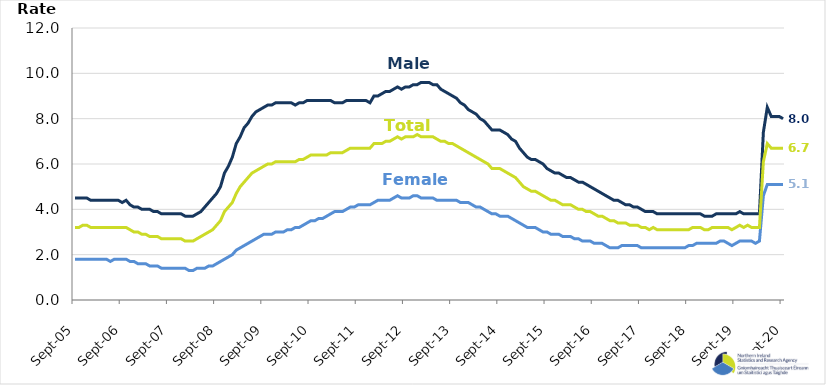
| Category | Male | Female | Total |
|---|---|---|---|
| 2005-09-01 | 4.5 | 1.8 | 3.2 |
| 2005-10-01 | 4.5 | 1.8 | 3.2 |
| 2005-11-01 | 4.5 | 1.8 | 3.3 |
| 2005-12-01 | 4.5 | 1.8 | 3.3 |
| 2006-01-01 | 4.4 | 1.8 | 3.2 |
| 2006-02-01 | 4.4 | 1.8 | 3.2 |
| 2006-03-01 | 4.4 | 1.8 | 3.2 |
| 2006-04-01 | 4.4 | 1.8 | 3.2 |
| 2006-05-01 | 4.4 | 1.8 | 3.2 |
| 2006-06-01 | 4.4 | 1.7 | 3.2 |
| 2006-07-01 | 4.4 | 1.8 | 3.2 |
| 2006-08-01 | 4.4 | 1.8 | 3.2 |
| 2006-09-01 | 4.3 | 1.8 | 3.2 |
| 2006-10-01 | 4.4 | 1.8 | 3.2 |
| 2006-11-01 | 4.2 | 1.7 | 3.1 |
| 2006-12-01 | 4.1 | 1.7 | 3 |
| 2007-01-01 | 4.1 | 1.6 | 3 |
| 2007-02-01 | 4 | 1.6 | 2.9 |
| 2007-03-01 | 4 | 1.6 | 2.9 |
| 2007-04-01 | 4 | 1.5 | 2.8 |
| 2007-05-01 | 3.9 | 1.5 | 2.8 |
| 2007-06-01 | 3.9 | 1.5 | 2.8 |
| 2007-07-01 | 3.8 | 1.4 | 2.7 |
| 2007-08-01 | 3.8 | 1.4 | 2.7 |
| 2007-09-01 | 3.8 | 1.4 | 2.7 |
| 2007-10-01 | 3.8 | 1.4 | 2.7 |
| 2007-11-01 | 3.8 | 1.4 | 2.7 |
| 2007-12-01 | 3.8 | 1.4 | 2.7 |
| 2008-01-01 | 3.7 | 1.4 | 2.6 |
| 2008-02-01 | 3.7 | 1.3 | 2.6 |
| 2008-03-01 | 3.7 | 1.3 | 2.6 |
| 2008-04-01 | 3.8 | 1.4 | 2.7 |
| 2008-05-01 | 3.9 | 1.4 | 2.8 |
| 2008-06-01 | 4.1 | 1.4 | 2.9 |
| 2008-07-01 | 4.3 | 1.5 | 3 |
| 2008-08-01 | 4.5 | 1.5 | 3.1 |
| 2008-09-01 | 4.7 | 1.6 | 3.3 |
| 2008-10-01 | 5 | 1.7 | 3.5 |
| 2008-11-01 | 5.6 | 1.8 | 3.9 |
| 2008-12-01 | 5.9 | 1.9 | 4.1 |
| 2009-01-01 | 6.3 | 2 | 4.3 |
| 2009-02-01 | 6.9 | 2.2 | 4.7 |
| 2009-03-01 | 7.2 | 2.3 | 5 |
| 2009-04-01 | 7.6 | 2.4 | 5.2 |
| 2009-05-01 | 7.8 | 2.5 | 5.4 |
| 2009-06-01 | 8.1 | 2.6 | 5.6 |
| 2009-07-01 | 8.3 | 2.7 | 5.7 |
| 2009-08-01 | 8.4 | 2.8 | 5.8 |
| 2009-09-01 | 8.5 | 2.9 | 5.9 |
| 2009-10-01 | 8.6 | 2.9 | 6 |
| 2009-11-01 | 8.6 | 2.9 | 6 |
| 2009-12-01 | 8.7 | 3 | 6.1 |
| 2010-01-01 | 8.7 | 3 | 6.1 |
| 2010-02-01 | 8.7 | 3 | 6.1 |
| 2010-03-01 | 8.7 | 3.1 | 6.1 |
| 2010-04-01 | 8.7 | 3.1 | 6.1 |
| 2010-05-01 | 8.6 | 3.2 | 6.1 |
| 2010-06-01 | 8.7 | 3.2 | 6.2 |
| 2010-07-01 | 8.7 | 3.3 | 6.2 |
| 2010-08-01 | 8.8 | 3.4 | 6.3 |
| 2010-09-01 | 8.8 | 3.5 | 6.4 |
| 2010-10-01 | 8.8 | 3.5 | 6.4 |
| 2010-11-01 | 8.8 | 3.6 | 6.4 |
| 2010-12-01 | 8.8 | 3.6 | 6.4 |
| 2011-01-01 | 8.8 | 3.7 | 6.4 |
| 2011-02-01 | 8.8 | 3.8 | 6.5 |
| 2011-03-01 | 8.7 | 3.9 | 6.5 |
| 2011-04-01 | 8.7 | 3.9 | 6.5 |
| 2011-05-01 | 8.7 | 3.9 | 6.5 |
| 2011-06-01 | 8.8 | 4 | 6.6 |
| 2011-07-01 | 8.8 | 4.1 | 6.7 |
| 2011-08-01 | 8.8 | 4.1 | 6.7 |
| 2011-09-01 | 8.8 | 4.2 | 6.7 |
| 2011-10-01 | 8.8 | 4.2 | 6.7 |
| 2011-11-01 | 8.8 | 4.2 | 6.7 |
| 2011-12-01 | 8.7 | 4.2 | 6.7 |
| 2012-01-01 | 9 | 4.3 | 6.9 |
| 2012-02-01 | 9 | 4.4 | 6.9 |
| 2012-03-01 | 9.1 | 4.4 | 6.9 |
| 2012-04-01 | 9.2 | 4.4 | 7 |
| 2012-05-01 | 9.2 | 4.4 | 7 |
| 2012-06-01 | 9.3 | 4.5 | 7.1 |
| 2012-07-01 | 9.4 | 4.6 | 7.2 |
| 2012-08-01 | 9.3 | 4.5 | 7.1 |
| 2012-09-01 | 9.4 | 4.5 | 7.2 |
| 2012-10-01 | 9.4 | 4.5 | 7.2 |
| 2012-11-01 | 9.5 | 4.6 | 7.2 |
| 2012-12-01 | 9.5 | 4.6 | 7.3 |
| 2013-01-01 | 9.6 | 4.5 | 7.2 |
| 2013-02-01 | 9.6 | 4.5 | 7.2 |
| 2013-03-01 | 9.6 | 4.5 | 7.2 |
| 2013-04-01 | 9.5 | 4.5 | 7.2 |
| 2013-05-01 | 9.5 | 4.4 | 7.1 |
| 2013-06-01 | 9.3 | 4.4 | 7 |
| 2013-07-01 | 9.2 | 4.4 | 7 |
| 2013-08-01 | 9.1 | 4.4 | 6.9 |
| 2013-09-01 | 9 | 4.4 | 6.9 |
| 2013-10-01 | 8.9 | 4.4 | 6.8 |
| 2013-11-01 | 8.7 | 4.3 | 6.7 |
| 2013-12-01 | 8.6 | 4.3 | 6.6 |
| 2014-01-01 | 8.4 | 4.3 | 6.5 |
| 2014-02-01 | 8.3 | 4.2 | 6.4 |
| 2014-03-01 | 8.2 | 4.1 | 6.3 |
| 2014-04-01 | 8 | 4.1 | 6.2 |
| 2014-05-01 | 7.9 | 4 | 6.1 |
| 2014-06-01 | 7.7 | 3.9 | 6 |
| 2014-07-01 | 7.5 | 3.8 | 5.8 |
| 2014-08-01 | 7.5 | 3.8 | 5.8 |
| 2014-09-01 | 7.5 | 3.7 | 5.8 |
| 2014-10-01 | 7.4 | 3.7 | 5.7 |
| 2014-11-01 | 7.3 | 3.7 | 5.6 |
| 2014-12-01 | 7.1 | 3.6 | 5.5 |
| 2015-01-01 | 7 | 3.5 | 5.4 |
| 2015-02-01 | 6.7 | 3.4 | 5.2 |
| 2015-03-01 | 6.5 | 3.3 | 5 |
| 2015-04-01 | 6.3 | 3.2 | 4.9 |
| 2015-05-01 | 6.2 | 3.2 | 4.8 |
| 2015-06-01 | 6.2 | 3.2 | 4.8 |
| 2015-07-01 | 6.1 | 3.1 | 4.7 |
| 2015-08-01 | 6 | 3 | 4.6 |
| 2015-09-01 | 5.8 | 3 | 4.5 |
| 2015-10-01 | 5.7 | 2.9 | 4.4 |
| 2015-11-01 | 5.6 | 2.9 | 4.4 |
| 2015-12-01 | 5.6 | 2.9 | 4.3 |
| 2016-01-01 | 5.5 | 2.8 | 4.2 |
| 2016-02-01 | 5.4 | 2.8 | 4.2 |
| 2016-03-01 | 5.4 | 2.8 | 4.2 |
| 2016-04-01 | 5.3 | 2.7 | 4.1 |
| 2016-05-01 | 5.2 | 2.7 | 4 |
| 2016-06-01 | 5.2 | 2.6 | 4 |
| 2016-07-01 | 5.1 | 2.6 | 3.9 |
| 2016-08-01 | 5 | 2.6 | 3.9 |
| 2016-09-01 | 4.9 | 2.5 | 3.8 |
| 2016-10-01 | 4.8 | 2.5 | 3.7 |
| 2016-11-01 | 4.7 | 2.5 | 3.7 |
| 2016-12-01 | 4.6 | 2.4 | 3.6 |
| 2017-01-01 | 4.5 | 2.3 | 3.5 |
| 2017-02-01 | 4.4 | 2.3 | 3.5 |
| 2017-03-01 | 4.4 | 2.3 | 3.4 |
| 2017-04-01 | 4.3 | 2.4 | 3.4 |
| 2017-05-01 | 4.2 | 2.4 | 3.4 |
| 2017-06-01 | 4.2 | 2.4 | 3.3 |
| 2017-07-01 | 4.1 | 2.4 | 3.3 |
| 2017-08-01 | 4.1 | 2.4 | 3.3 |
| 2017-09-01 | 4 | 2.3 | 3.2 |
| 2017-10-01 | 3.9 | 2.3 | 3.2 |
| 2017-11-01 | 3.9 | 2.3 | 3.1 |
| 2017-12-01 | 3.9 | 2.3 | 3.2 |
| 2018-01-01 | 3.8 | 2.3 | 3.1 |
| 2018-02-01 | 3.8 | 2.3 | 3.1 |
| 2018-03-01 | 3.8 | 2.3 | 3.1 |
| 2018-04-01 | 3.8 | 2.3 | 3.1 |
| 2018-05-01 | 3.8 | 2.3 | 3.1 |
| 2018-06-01 | 3.8 | 2.3 | 3.1 |
| 2018-07-01 | 3.8 | 2.3 | 3.1 |
| 2018-08-01 | 3.8 | 2.3 | 3.1 |
| 2018-09-01 | 3.8 | 2.4 | 3.1 |
| 2018-10-01 | 3.8 | 2.4 | 3.2 |
| 2018-11-01 | 3.8 | 2.5 | 3.2 |
| 2018-12-01 | 3.8 | 2.5 | 3.2 |
| 2019-01-01 | 3.7 | 2.5 | 3.1 |
| 2019-02-01 | 3.7 | 2.5 | 3.1 |
| 2019-03-01 | 3.7 | 2.5 | 3.2 |
| 2019-04-01 | 3.8 | 2.5 | 3.2 |
| 2019-05-01 | 3.8 | 2.6 | 3.2 |
| 2019-06-01 | 3.8 | 2.6 | 3.2 |
| 2019-07-01 | 3.8 | 2.5 | 3.2 |
| 2019-08-01 | 3.8 | 2.4 | 3.1 |
| 2019-09-01 | 3.8 | 2.5 | 3.2 |
| 2019-10-01 | 3.9 | 2.6 | 3.3 |
| 2019-11-01 | 3.8 | 2.6 | 3.2 |
| 2019-12-01 | 3.8 | 2.6 | 3.3 |
| 2020-01-01 | 3.8 | 2.6 | 3.2 |
| 2020-02-01 | 3.8 | 2.5 | 3.2 |
| 2020-03-01 | 3.8 | 2.6 | 3.2 |
| 2020-04-01 | 7.4 | 4.6 | 6.1 |
| 2020-05-01 | 8.5 | 5.1 | 6.9 |
| 2020-06-01 | 8.1 | 5.1 | 6.7 |
| 2020-07-01 | 8.1 | 5.1 | 6.7 |
| 2020-08-01 | 8.1 | 5.1 | 6.7 |
| 2020-09-01 | 8 | 5.1 | 6.7 |